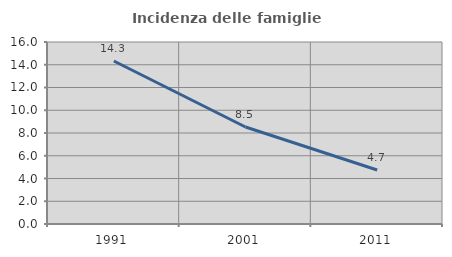
| Category | Incidenza delle famiglie numerose |
|---|---|
| 1991.0 | 14.329 |
| 2001.0 | 8.528 |
| 2011.0 | 4.748 |